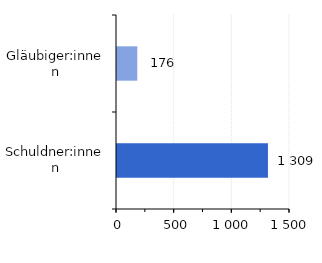
| Category | Series 0 |
|---|---|
| Gläubiger:innen | 176 |
| Schuldner:innen | 1309 |